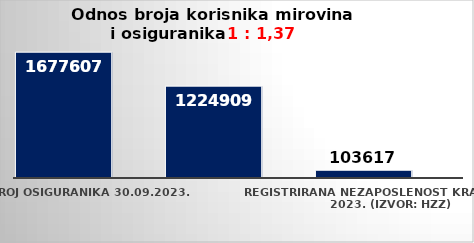
| Category | Series 0 | Series 1 |
|---|---|---|
| Broj osiguranika 30.09.2023. | 1677607 |  |
| Broj korisnika mirovine za rujan 2023. (isplata u listopadu 2023.) | 1224909 |  |
| Registrirana nezaposlenost krajem rujna 2023. (izvor: HZZ) | 103617 |  |